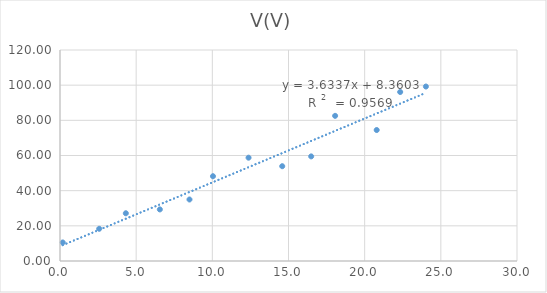
| Category | V(V) |
|---|---|
| 0.17908833236415345 | 10.546 |
| 2.57302876919328 | 18.319 |
| 4.321392241195258 | 27.148 |
| 6.553315780896324 | 29.333 |
| 8.500213754776183 | 34.978 |
| 10.041796081907918 | 48.218 |
| 12.377698217533624 | 58.756 |
| 14.588588238960307 | 53.913 |
| 16.48885090078175 | 59.494 |
| 18.06068892523254 | 82.552 |
| 20.789195307454953 | 74.484 |
| 22.332024793597032 | 96.115 |
| 24.019876515262798 | 99.225 |